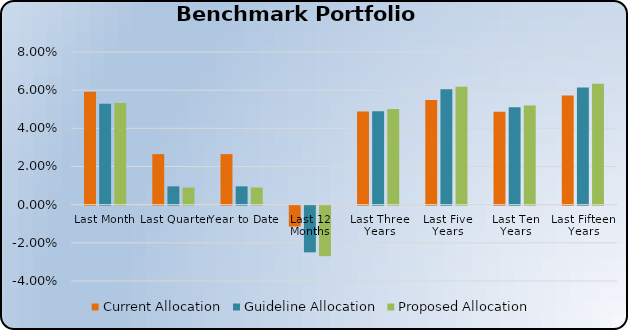
| Category | Current Allocation | Guideline Allocation | Proposed Allocation |
|---|---|---|---|
| Last Month | 0.059 | 0.053 | 0.053 |
| Last Quarter | 0.026 | 0.01 | 0.009 |
| Year to Date | 0.026 | 0.01 | 0.009 |
| Last 12 Months | -0.011 | -0.024 | -0.026 |
| Last Three Years | 0.049 | 0.049 | 0.05 |
| Last Five Years | 0.055 | 0.06 | 0.062 |
| Last Ten Years | 0.049 | 0.051 | 0.052 |
| Last Fifteen Years | 0.057 | 0.061 | 0.063 |